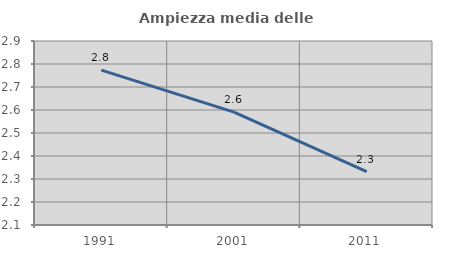
| Category | Ampiezza media delle famiglie |
|---|---|
| 1991.0 | 2.773 |
| 2001.0 | 2.591 |
| 2011.0 | 2.332 |